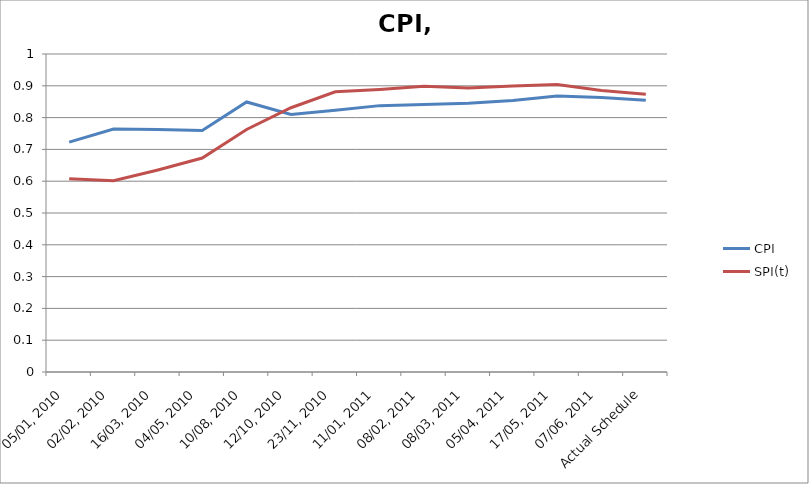
| Category | CPI | SPI(t) |
|---|---|---|
| 05/01, 2010 | 0.723 | 0.608 |
| 02/02, 2010 | 0.764 | 0.601 |
| 16/03, 2010 | 0.763 | 0.635 |
| 04/05, 2010 | 0.759 | 0.673 |
| 10/08, 2010 | 0.849 | 0.763 |
| 12/10, 2010 | 0.81 | 0.831 |
| 23/11, 2010 | 0.823 | 0.881 |
| 11/01, 2011 | 0.838 | 0.889 |
| 08/02, 2011 | 0.841 | 0.898 |
| 08/03, 2011 | 0.845 | 0.893 |
| 05/04, 2011 | 0.854 | 0.899 |
| 17/05, 2011 | 0.868 | 0.904 |
| 07/06, 2011 | 0.863 | 0.885 |
| Actual Schedule | 0.855 | 0.874 |